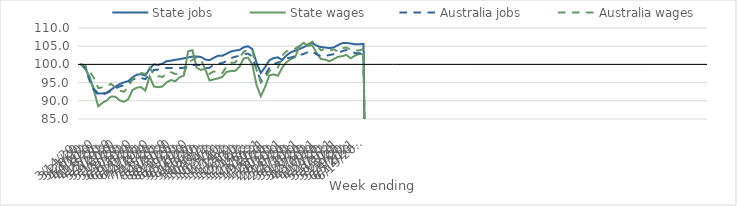
| Category | State jobs | State wages | Australia jobs | Australia wages |
|---|---|---|---|---|
| 14/03/2020 | 100 | 100 | 100 | 100 |
| 21/03/2020 | 99.176 | 98.604 | 98.971 | 99.604 |
| 28/03/2020 | 95.989 | 96.654 | 95.467 | 98.106 |
| 04/04/2020 | 93.28 | 92.66 | 92.922 | 96.239 |
| 11/04/2020 | 91.988 | 88.491 | 91.648 | 93.488 |
| 18/04/2020 | 92.034 | 89.453 | 91.632 | 93.693 |
| 25/04/2020 | 92.258 | 90.112 | 92.163 | 94.114 |
| 02/05/2020 | 93.044 | 91.219 | 92.661 | 94.661 |
| 09/05/2020 | 93.883 | 91.098 | 93.345 | 93.586 |
| 16/05/2020 | 94.59 | 90.144 | 93.938 | 92.82 |
| 23/05/2020 | 95.073 | 89.712 | 94.296 | 92.472 |
| 30/05/2020 | 95.4 | 90.418 | 94.804 | 93.802 |
| 06/06/2020 | 96.418 | 92.936 | 95.79 | 95.983 |
| 13/06/2020 | 97.17 | 93.609 | 96.291 | 96.659 |
| 20/06/2020 | 97.285 | 93.773 | 96.307 | 97.626 |
| 27/06/2020 | 96.917 | 92.816 | 95.924 | 97.398 |
| 04/07/2020 | 98.818 | 96.723 | 97.286 | 99.305 |
| 11/07/2020 | 99.983 | 93.953 | 98.453 | 96.936 |
| 18/07/2020 | 99.856 | 93.73 | 98.574 | 96.771 |
| 25/07/2020 | 100.203 | 93.916 | 98.8 | 96.557 |
| 01/08/2020 | 100.894 | 95.069 | 99.036 | 97.398 |
| 08/08/2020 | 101.025 | 95.711 | 99.039 | 97.865 |
| 15/08/2020 | 101.27 | 95.361 | 98.915 | 97.373 |
| 22/08/2020 | 101.435 | 96.468 | 99.01 | 97.336 |
| 29/08/2020 | 101.678 | 96.93 | 99.05 | 97.544 |
| 05/09/2020 | 101.898 | 103.568 | 99.381 | 100.291 |
| 12/09/2020 | 102.136 | 103.903 | 99.754 | 101.228 |
| 19/09/2020 | 102.176 | 99.075 | 99.918 | 101.971 |
| 26/09/2020 | 102.032 | 98.464 | 99.725 | 101.154 |
| 03/10/2020 | 101.349 | 98.777 | 98.937 | 98.795 |
| 10/10/2020 | 101.158 | 95.587 | 99.064 | 97.403 |
| 17/10/2020 | 101.818 | 95.894 | 99.896 | 98.12 |
| 24/10/2020 | 102.359 | 96.148 | 100.185 | 97.546 |
| 31/10/2020 | 102.391 | 96.59 | 100.363 | 97.615 |
| 07/11/2020 | 102.941 | 97.934 | 100.966 | 99.446 |
| 14/11/2020 | 103.539 | 98.164 | 101.741 | 100.424 |
| 21/11/2020 | 103.808 | 98.228 | 102.085 | 100.522 |
| 28/11/2020 | 103.966 | 99.3 | 102.383 | 101.813 |
| 05/12/2020 | 104.71 | 101.657 | 102.872 | 103.509 |
| 12/12/2020 | 104.978 | 101.864 | 102.957 | 104.014 |
| 19/12/2020 | 104.223 | 100.047 | 102.168 | 103.915 |
| 26/12/2020 | 100.447 | 94.25 | 98.391 | 98.452 |
| 02/01/2021 | 97.632 | 91.267 | 95.58 | 95.006 |
| 09/01/2021 | 99.252 | 93.84 | 96.988 | 96.148 |
| 16/01/2021 | 101.18 | 96.964 | 99.101 | 98.251 |
| 23/01/2021 | 101.742 | 97.26 | 100.068 | 98.817 |
| 30/01/2021 | 101.931 | 96.876 | 100.556 | 99.148 |
| 06/02/2021 | 101.231 | 99.128 | 100.923 | 102.467 |
| 13/02/2021 | 102.459 | 100.604 | 101.643 | 103.619 |
| 20/02/2021 | 103.329 | 101.468 | 101.902 | 103.78 |
| 27/02/2021 | 103.779 | 101.958 | 102.3 | 104.333 |
| 06/03/2021 | 104.219 | 104.92 | 102.521 | 105.064 |
| 13/03/2021 | 104.729 | 105.933 | 102.877 | 105.052 |
| 20/03/2021 | 105.29 | 105.048 | 103.384 | 105.539 |
| 27/03/2021 | 105.916 | 105.259 | 103.612 | 106.245 |
| 03/04/2021 | 105.166 | 103.239 | 102.769 | 105.395 |
| 10/04/2021 | 104.769 | 101.48 | 102.293 | 103.884 |
| 17/04/2021 | 104.638 | 101.316 | 102.308 | 104.211 |
| 24/04/2021 | 104.467 | 100.871 | 102.558 | 103.772 |
| 01/05/2021 | 104.655 | 101.423 | 102.806 | 104.122 |
| 08/05/2021 | 105.28 | 102.087 | 102.974 | 103.594 |
| 15/05/2021 | 105.836 | 102.245 | 103.642 | 104.439 |
| 22/05/2021 | 105.89 | 102.606 | 103.934 | 104.625 |
| 29/05/2021 | 105.741 | 101.68 | 103.744 | 104.038 |
| 05/06/2021 | 105.521 | 102.42 | 103.091 | 103.805 |
| 12/06/2021 | 105.534 | 102.882 | 103.033 | 103.851 |
| 19/06/2021 | 105.624 | 102.76 | 103.366 | 104.254 |